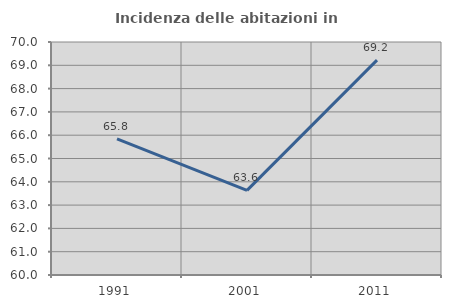
| Category | Incidenza delle abitazioni in proprietà  |
|---|---|
| 1991.0 | 65.843 |
| 2001.0 | 63.632 |
| 2011.0 | 69.22 |